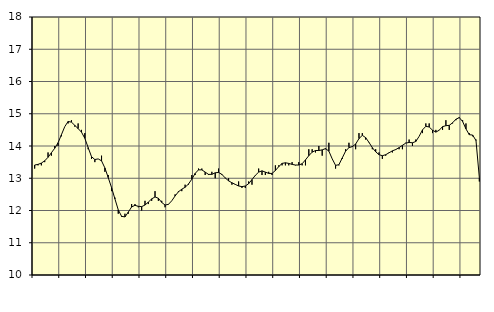
| Category | Piggar | Handel, SNI 45-47 |
|---|---|---|
| nan | 13.3 | 13.41 |
| 87.0 | 13.4 | 13.43 |
| 87.0 | 13.4 | 13.47 |
| 87.0 | 13.5 | 13.54 |
| nan | 13.8 | 13.65 |
| 88.0 | 13.7 | 13.79 |
| 88.0 | 14 | 13.93 |
| 88.0 | 14 | 14.1 |
| nan | 14.3 | 14.35 |
| 89.0 | 14.6 | 14.6 |
| 89.0 | 14.7 | 14.76 |
| 89.0 | 14.8 | 14.74 |
| nan | 14.6 | 14.64 |
| 90.0 | 14.7 | 14.54 |
| 90.0 | 14.5 | 14.43 |
| 90.0 | 14.4 | 14.24 |
| nan | 13.9 | 13.95 |
| 91.0 | 13.6 | 13.67 |
| 91.0 | 13.5 | 13.58 |
| 91.0 | 13.6 | 13.6 |
| nan | 13.7 | 13.54 |
| 92.0 | 13.2 | 13.32 |
| 92.0 | 13.1 | 13.02 |
| 92.0 | 12.6 | 12.71 |
| nan | 12.4 | 12.36 |
| 93.0 | 11.9 | 12.02 |
| 93.0 | 11.8 | 11.82 |
| 93.0 | 11.9 | 11.8 |
| nan | 11.9 | 11.95 |
| 94.0 | 12.2 | 12.11 |
| 94.0 | 12.2 | 12.16 |
| 94.0 | 12.1 | 12.13 |
| nan | 12 | 12.12 |
| 95.0 | 12.3 | 12.17 |
| 95.0 | 12.2 | 12.26 |
| 95.0 | 12.3 | 12.36 |
| nan | 12.6 | 12.42 |
| 96.0 | 12.3 | 12.38 |
| 96.0 | 12.3 | 12.25 |
| 96.0 | 12.1 | 12.17 |
| nan | 12.2 | 12.19 |
| 97.0 | 12.3 | 12.3 |
| 97.0 | 12.5 | 12.45 |
| 97.0 | 12.6 | 12.58 |
| nan | 12.6 | 12.66 |
| 98.0 | 12.8 | 12.72 |
| 98.0 | 12.8 | 12.82 |
| 98.0 | 13.1 | 12.97 |
| nan | 13.1 | 13.15 |
| 99.0 | 13.3 | 13.26 |
| 99.0 | 13.3 | 13.26 |
| 99.0 | 13.1 | 13.19 |
| nan | 13.1 | 13.12 |
| 0.0 | 13.2 | 13.12 |
| 0.0 | 13 | 13.17 |
| 0.0 | 13.3 | 13.18 |
| nan | 13.1 | 13.12 |
| 1.0 | 13 | 13.01 |
| 1.0 | 13 | 12.92 |
| 1.0 | 12.8 | 12.86 |
| nan | 12.8 | 12.81 |
| 2.0 | 12.9 | 12.76 |
| 2.0 | 12.7 | 12.74 |
| 2.0 | 12.7 | 12.76 |
| nan | 12.9 | 12.83 |
| 3.0 | 12.8 | 12.96 |
| 3.0 | 13.1 | 13.09 |
| 3.0 | 13.3 | 13.19 |
| nan | 13.1 | 13.23 |
| 4.0 | 13.1 | 13.19 |
| 4.0 | 13.2 | 13.15 |
| 4.0 | 13.1 | 13.15 |
| nan | 13.4 | 13.24 |
| 5.0 | 13.4 | 13.36 |
| 5.0 | 13.4 | 13.46 |
| 5.0 | 13.4 | 13.48 |
| nan | 13.4 | 13.46 |
| 6.0 | 13.5 | 13.43 |
| 6.0 | 13.4 | 13.41 |
| 6.0 | 13.5 | 13.41 |
| nan | 13.4 | 13.45 |
| 7.0 | 13.4 | 13.57 |
| 7.0 | 13.9 | 13.7 |
| 7.0 | 13.9 | 13.81 |
| nan | 13.8 | 13.86 |
| 8.0 | 14 | 13.86 |
| 8.0 | 13.7 | 13.88 |
| 8.0 | 13.9 | 13.92 |
| nan | 14.1 | 13.84 |
| 9.0 | 13.6 | 13.6 |
| 9.0 | 13.3 | 13.4 |
| 9.0 | 13.4 | 13.42 |
| nan | 13.6 | 13.63 |
| 10.0 | 13.9 | 13.84 |
| 10.0 | 14.1 | 13.95 |
| 10.0 | 14 | 13.98 |
| nan | 13.9 | 14.06 |
| 11.0 | 14.4 | 14.23 |
| 11.0 | 14.4 | 14.33 |
| 11.0 | 14.2 | 14.26 |
| nan | 14.1 | 14.11 |
| 12.0 | 13.9 | 13.95 |
| 12.0 | 13.9 | 13.82 |
| 12.0 | 13.8 | 13.73 |
| nan | 13.6 | 13.7 |
| 13.0 | 13.7 | 13.73 |
| 13.0 | 13.8 | 13.79 |
| 13.0 | 13.8 | 13.85 |
| nan | 13.9 | 13.89 |
| 14.0 | 13.9 | 13.95 |
| 14.0 | 13.9 | 14.02 |
| 14.0 | 14.1 | 14.09 |
| nan | 14.2 | 14.11 |
| 15.0 | 14 | 14.1 |
| 15.0 | 14.2 | 14.14 |
| 15.0 | 14.3 | 14.3 |
| nan | 14.4 | 14.5 |
| 16.0 | 14.7 | 14.61 |
| 16.0 | 14.7 | 14.59 |
| 16.0 | 14.4 | 14.49 |
| nan | 14.5 | 14.43 |
| 17.0 | 14.5 | 14.49 |
| 17.0 | 14.5 | 14.6 |
| 17.0 | 14.8 | 14.63 |
| nan | 14.5 | 14.64 |
| 18.0 | 14.7 | 14.72 |
| 18.0 | 14.8 | 14.83 |
| 18.0 | 14.9 | 14.88 |
| nan | 14.8 | 14.76 |
| 19.0 | 14.7 | 14.53 |
| 19.0 | 14.4 | 14.35 |
| 19.0 | 14.3 | 14.34 |
| nan | 14.2 | 14.17 |
| 20.0 | 12.9 | 13.02 |